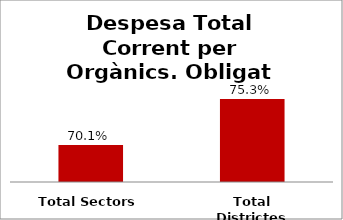
| Category | Series 0 |
|---|---|
| Total Sectors | 0.701 |
| Total Districtes | 0.753 |